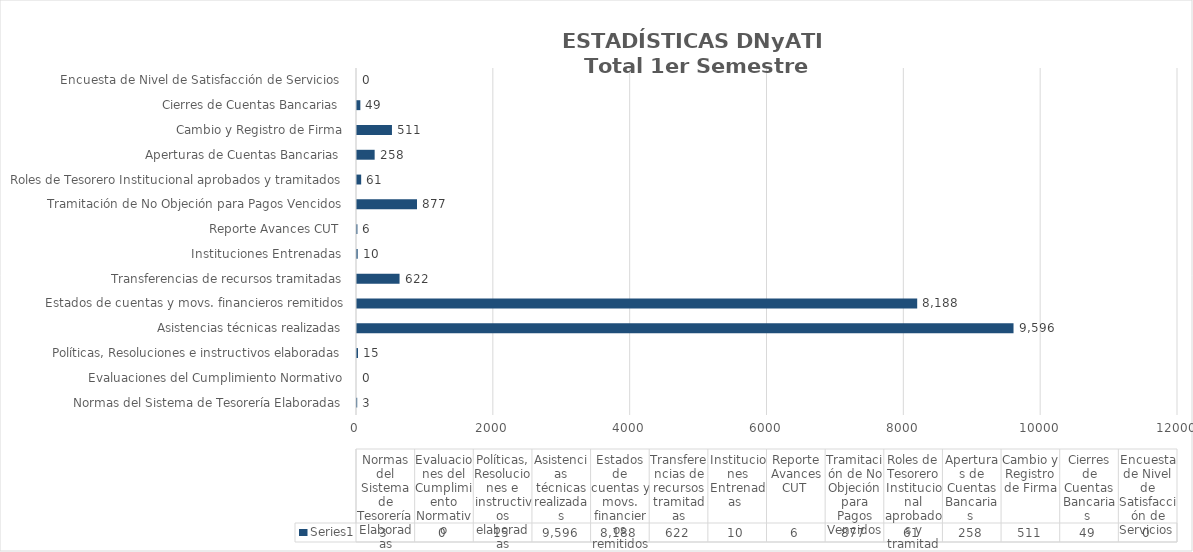
| Category | Series 0 |
|---|---|
| Normas del Sistema de Tesorería Elaboradas | 3 |
| Evaluaciones del Cumplimiento Normativo | 0 |
| Políticas, Resoluciones e instructivos elaboradas | 15 |
| Asistencias técnicas realizadas | 9596 |
| Estados de cuentas y movs. financieros remitidos | 8188 |
| Transferencias de recursos tramitadas | 622 |
| Instituciones Entrenadas  | 10 |
| Reporte Avances CUT  | 6 |
| Tramitación de No Objeción para Pagos Vencidos | 877 |
| Roles de Tesorero Institucional aprobados y tramitados | 61 |
| Aperturas de Cuentas Bancarias  | 258 |
| Cambio y Registro de Firma | 511 |
| Cierres de Cuentas Bancarias  | 49 |
| Encuesta de Nivel de Satisfacción de Servicios  | 0 |